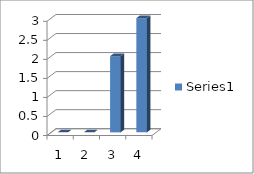
| Category | Series 0 |
|---|---|
| 0 | 0 |
| 1 | 0 |
| 2 | 2 |
| 3 | 3 |